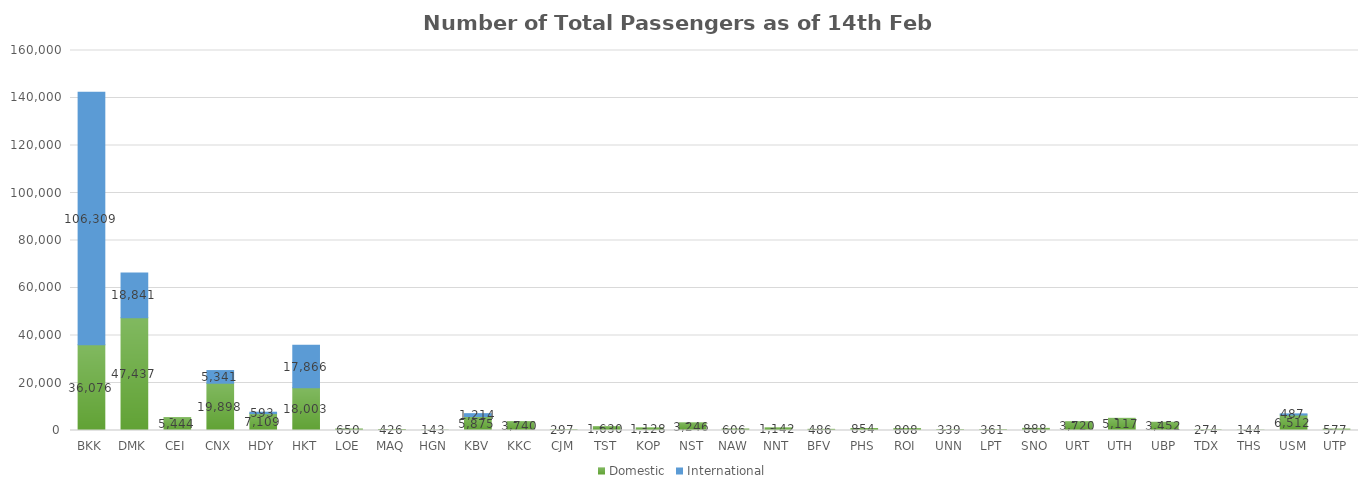
| Category | Domestic | International |
|---|---|---|
| BKK | 36076 | 106309 |
| DMK | 47437 | 18841 |
| CEI | 5444 | 0 |
| CNX | 19898 | 5341 |
| HDY | 7109 | 593 |
| HKT | 18003 | 17866 |
| LOE | 650 | 0 |
| MAQ | 426 | 0 |
| HGN | 143 | 0 |
| KBV | 5875 | 1214 |
| KKC | 3740 | 0 |
| CJM | 297 | 0 |
| TST | 1630 | 0 |
| KOP | 1128 | 0 |
| NST | 3246 | 0 |
| NAW | 606 | 0 |
| NNT | 1142 | 0 |
| BFV | 486 | 0 |
| PHS | 854 | 0 |
| ROI | 808 | 0 |
| UNN | 339 | 0 |
| LPT | 361 | 0 |
| SNO | 888 | 0 |
| URT | 3720 | 0 |
| UTH | 5117 | 0 |
| UBP | 3452 | 0 |
| TDX | 274 | 0 |
| THS | 144 | 0 |
| USM | 6512 | 487 |
| UTP | 577 | 0 |